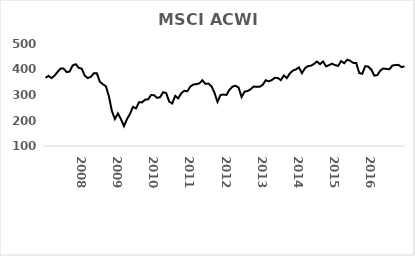
| Category | Series 0 |
|---|---|
| nan | 367.787 |
| nan | 374.725 |
| nan | 366.302 |
| nan | 376.176 |
| nan | 390.675 |
| nan | 403.99 |
| nan | 403.531 |
| nan | 389.873 |
| nan | 391.908 |
| nan | 415.896 |
| nan | 420.71 |
| nan | 406.596 |
| 2008.0 | 403.259 |
| nan | 375.853 |
| nan | 366.456 |
| nan | 371.143 |
| nan | 384.903 |
| nan | 385.475 |
| nan | 352.564 |
| nan | 341.975 |
| nan | 334.712 |
| nan | 295.175 |
| nan | 237.587 |
| nan | 205.509 |
| 2009.0 | 227.728 |
| nan | 205.327 |
| nan | 177.956 |
| nan | 205.211 |
| nan | 225.96 |
| nan | 253.293 |
| nan | 247.327 |
| nan | 271.598 |
| nan | 270.96 |
| nan | 281.55 |
| nan | 283.154 |
| nan | 299.574 |
| 2010.0 | 299.435 |
| nan | 288.526 |
| nan | 291.582 |
| nan | 310.66 |
| nan | 307.723 |
| nan | 274.133 |
| nan | 266.74 |
| nan | 296.695 |
| nan | 286.713 |
| nan | 306.692 |
| nan | 316.778 |
| nan | 314.386 |
| 2011.0 | 332.87 |
| nan | 340.981 |
| nan | 342.608 |
| nan | 345.661 |
| nan | 357.722 |
| nan | 343.623 |
| nan | 345.044 |
| nan | 334.335 |
| nan | 309.029 |
| nan | 273.005 |
| nan | 299.912 |
| nan | 301.681 |
| 2012.0 | 300.309 |
| nan | 320.78 |
| nan | 333.077 |
| nan | 336.266 |
| nan | 329.315 |
| nan | 292.014 |
| nan | 313.336 |
| nan | 315.551 |
| nan | 322.709 |
| nan | 333.296 |
| nan | 331.824 |
| nan | 332.406 |
| 2013.0 | 339.785 |
| nan | 357.759 |
| nan | 353.611 |
| nan | 358.47 |
| nan | 367.249 |
| nan | 366.93 |
| nan | 358.254 |
| nan | 376.514 |
| nan | 366.209 |
| nan | 384.616 |
| nan | 395.727 |
| nan | 400.28 |
| 2014.0 | 408.553 |
| nan | 385.664 |
| nan | 405.055 |
| nan | 413.446 |
| nan | 414.708 |
| nan | 422.071 |
| nan | 431.259 |
| nan | 420.908 |
| nan | 431.592 |
| nan | 412.261 |
| nan | 417.224 |
| nan | 422.836 |
| 2015.0 | 417.121 |
| nan | 414.105 |
| nan | 433.21 |
| nan | 424.555 |
| nan | 438.183 |
| nan | 434.232 |
| nan | 426.015 |
| nan | 425.315 |
| nan | 386.167 |
| nan | 383.232 |
| nan | 413.403 |
| nan | 411.151 |
| 2016.0 | 399.366 |
| nan | 375.986 |
| nan | 378.379 |
| nan | 396.009 |
| nan | 404.165 |
| nan | 402.183 |
| nan | 401.069 |
| nan | 415.653 |
| nan | 417.351 |
| nan | 418.234 |
| nan | 409.384 |
| nan | 412.46 |